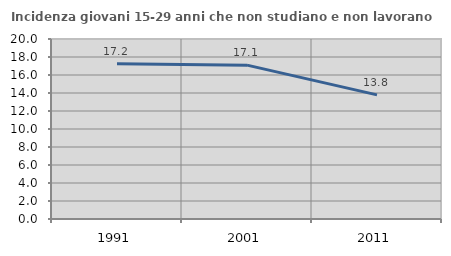
| Category | Incidenza giovani 15-29 anni che non studiano e non lavorano  |
|---|---|
| 1991.0 | 17.241 |
| 2001.0 | 17.094 |
| 2011.0 | 13.793 |